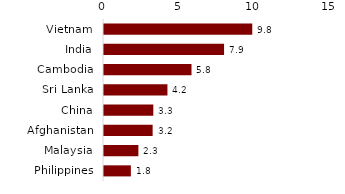
| Category | Series 0 |
|---|---|
| Vietnam | 9.797 |
| India | 7.933 |
| Cambodia | 5.782 |
| Sri Lanka | 4.192 |
| China | 3.259 |
| Afghanistan | 3.214 |
| Malaysia | 2.272 |
| Philippines | 1.775 |